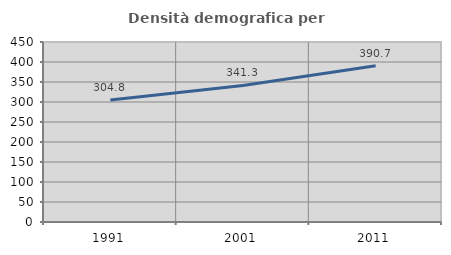
| Category | Densità demografica |
|---|---|
| 1991.0 | 304.846 |
| 2001.0 | 341.329 |
| 2011.0 | 390.732 |